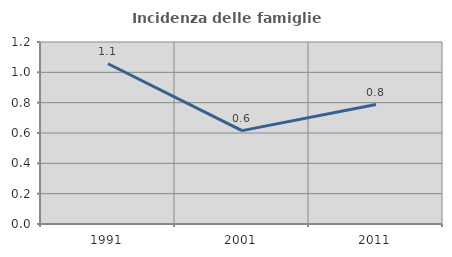
| Category | Incidenza delle famiglie numerose |
|---|---|
| 1991.0 | 1.057 |
| 2001.0 | 0.616 |
| 2011.0 | 0.787 |